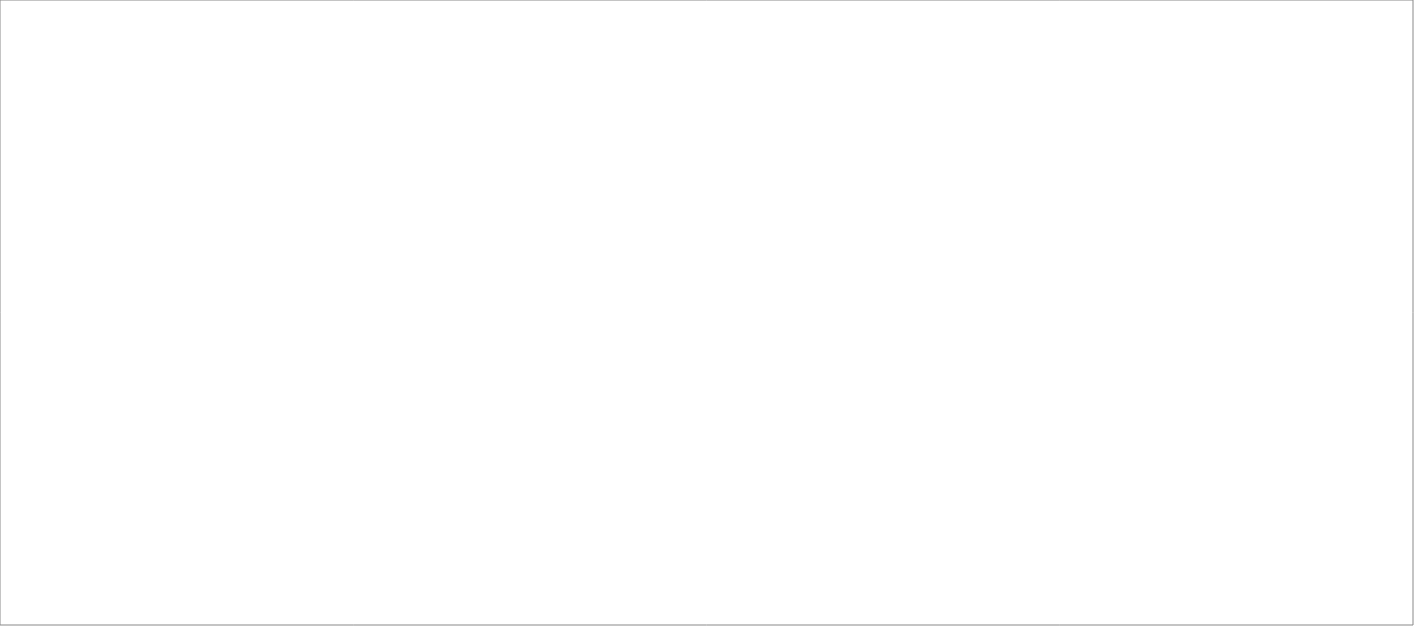
| Category | Total |
|---|---|
| Poolia Sverige AB | 85 |
| Randstad AB | 80 |
| Experis AB | 45 |
| Source Executive Recruitment Sweden AB | 25 |